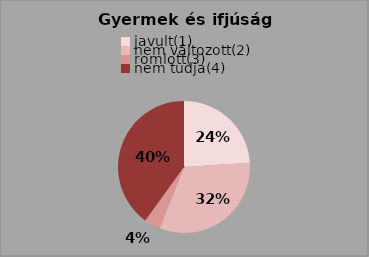
| Category | Series 0 | Series 1 |
|---|---|---|
| javult(1) | 6 | 24 |
| nem változott(2) | 8 | 32 |
| romlott(3) | 1 | 4 |
| nem tudja(4) | 10 | 40 |